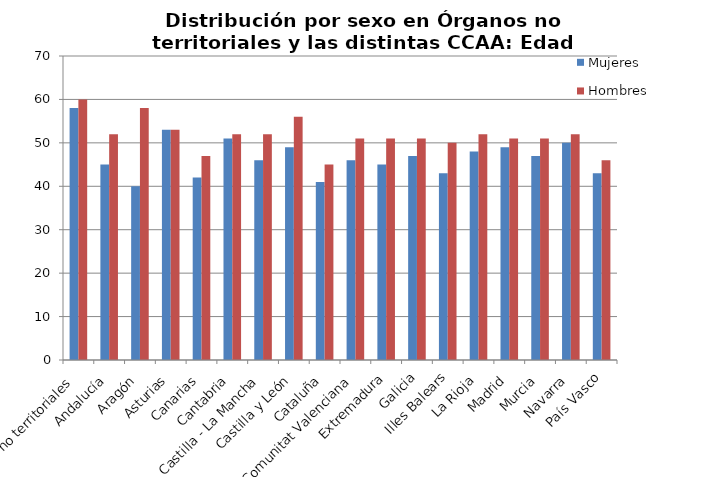
| Category | Mujeres | Hombres |
|---|---|---|
| Órganos no territoriales | 58 | 60 |
| Andalucía | 45 | 52 |
| Aragón | 40 | 58 |
| Asturias | 53 | 53 |
| Canarias | 42 | 47 |
| Cantabria | 51 | 52 |
| Castilla - La Mancha | 46 | 52 |
| Castilla y León | 49 | 56 |
| Cataluña | 41 | 45 |
| Comunitat Valenciana | 46 | 51 |
| Extremadura | 45 | 51 |
| Galicia | 47 | 51 |
| Illes Balears | 43 | 50 |
| La Rioja | 48 | 52 |
| Madrid | 49 | 51 |
| Murcia | 47 | 51 |
| Navarra | 50 | 52 |
| País Vasco | 43 | 46 |